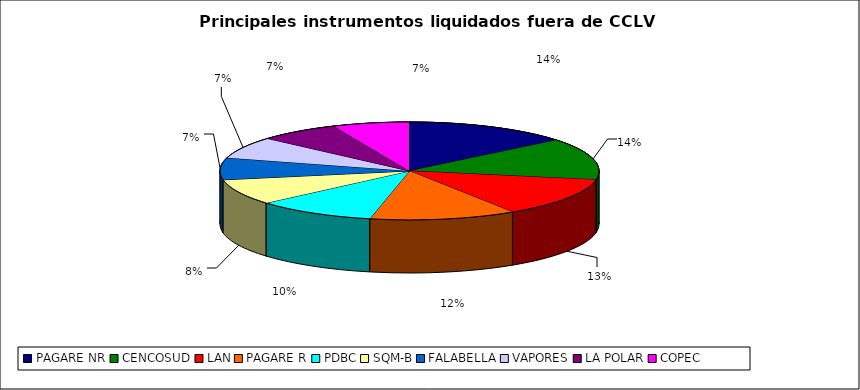
| Category | Series 0 |
|---|---|
| PAGARE NR | 1228 |
| CENCOSUD | 1192 |
| LAN | 1125 |
| PAGARE R | 1084 |
| PDBC | 892 |
| SQM-B | 733 |
| FALABELLA | 629 |
| VAPORES | 624 |
| LA POLAR | 598 |
| COPEC | 570 |